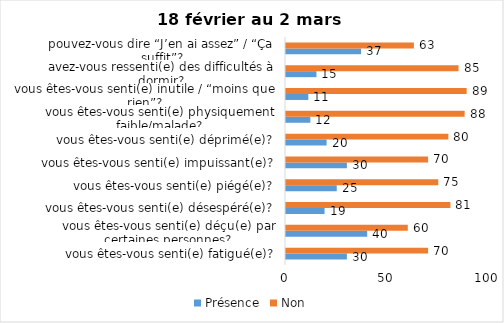
| Category | Présence | Non |
|---|---|---|
| vous êtes-vous senti(e) fatigué(e)? | 30 | 70 |
| vous êtes-vous senti(e) déçu(e) par certaines personnes? | 40 | 60 |
| vous êtes-vous senti(e) désespéré(e)? | 19 | 81 |
| vous êtes-vous senti(e) piégé(e)? | 25 | 75 |
| vous êtes-vous senti(e) impuissant(e)? | 30 | 70 |
| vous êtes-vous senti(e) déprimé(e)? | 20 | 80 |
| vous êtes-vous senti(e) physiquement faible/malade? | 12 | 88 |
| vous êtes-vous senti(e) inutile / “moins que rien”? | 11 | 89 |
| avez-vous ressenti(e) des difficultés à dormir? | 15 | 85 |
| pouvez-vous dire “J’en ai assez” / “Ça suffit”? | 37 | 63 |